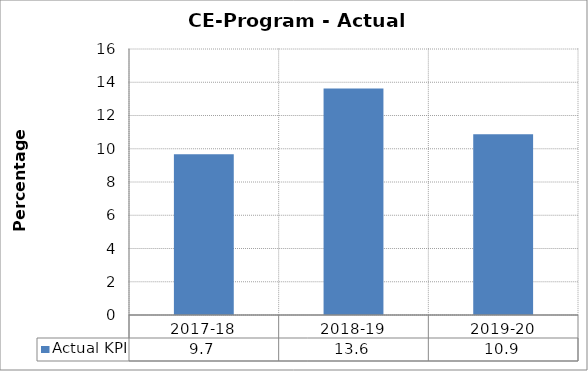
| Category | Actual KPI |
|---|---|
| 2017-18 | 9.667 |
| 2018-19 | 13.625 |
| 2019-20 | 10.875 |